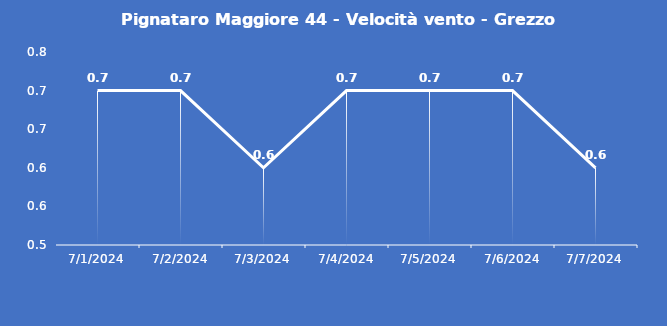
| Category | Pignataro Maggiore 44 - Velocità vento - Grezzo (m/s) |
|---|---|
| 7/1/24 | 0.7 |
| 7/2/24 | 0.7 |
| 7/3/24 | 0.6 |
| 7/4/24 | 0.7 |
| 7/5/24 | 0.7 |
| 7/6/24 | 0.7 |
| 7/7/24 | 0.6 |